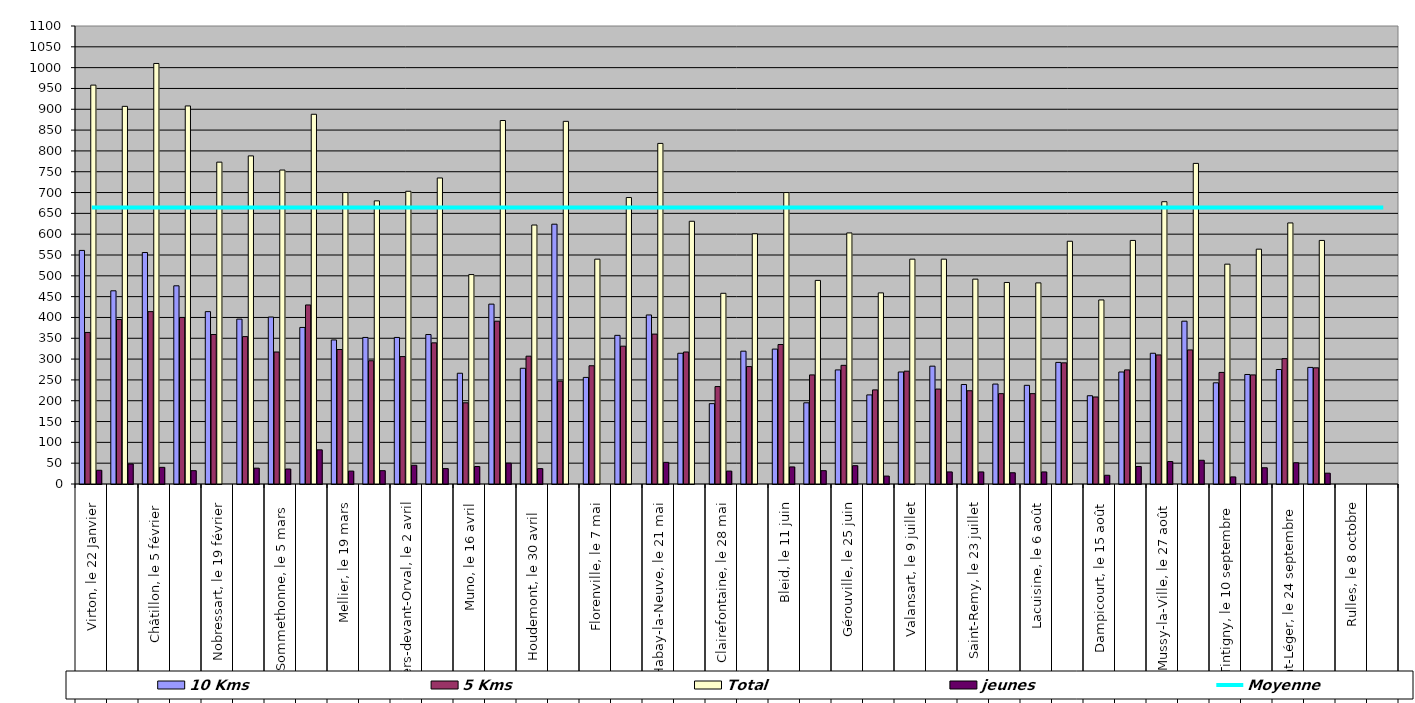
| Category | 10 Kms | 5 Kms | Total | jeunes |
|---|---|---|---|---|
| 0 | 561 | 364 | 958 | 33 |
| 1 | 464 | 395 | 907 | 48 |
| 2 | 556 | 414 | 1010 | 40 |
| 3 | 476 | 400 | 908 | 32 |
| 4 | 414 | 359 | 773 | 0 |
| 5 | 396 | 354 | 788 | 38 |
| 6 | 401 | 317 | 754 | 36 |
| 7 | 376 | 430 | 888 | 82 |
| 8 | 346 | 323 | 700 | 31 |
| 9 | 352 | 296 | 680 | 32 |
| 10 | 352 | 306 | 703 | 45 |
| 11 | 359 | 339 | 735 | 37 |
| 12 | 266 | 195 | 503 | 42 |
| 13 | 432 | 391 | 873 | 50 |
| 14 | 278 | 307 | 622 | 37 |
| 15 | 624 | 247 | 871 | 0 |
| 16 | 256 | 284 | 540 | 0 |
| 17 | 357 | 331 | 688 | 0 |
| 18 | 406 | 360 | 818 | 52 |
| 19 | 314 | 317 | 631 | 0 |
| 20 | 193 | 234 | 458 | 31 |
| 21 | 319 | 282 | 601 | 0 |
| 22 | 324 | 335 | 700 | 41 |
| 23 | 195 | 262 | 489 | 32 |
| 24 | 274 | 285 | 603 | 44 |
| 25 | 214 | 226 | 459 | 19 |
| 26 | 269 | 271 | 540 | 0 |
| 27 | 283 | 228 | 540 | 29 |
| 28 | 239 | 224 | 492 | 29 |
| 29 | 240 | 217 | 484 | 27 |
| 30 | 237 | 217 | 483 | 29 |
| 31 | 292 | 291 | 583 | 0 |
| 32 | 212 | 209 | 442 | 21 |
| 33 | 269 | 274 | 585 | 42 |
| 34 | 314 | 310 | 678 | 54 |
| 35 | 391 | 322 | 770 | 57 |
| 36 | 243 | 268 | 528 | 17 |
| 37 | 263 | 262 | 564 | 39 |
| 38 | 275 | 301 | 627 | 51 |
| 39 | 280 | 279 | 585 | 26 |
| 40 | 0 | 0 | 0 | 0 |
| 41 | 0 | 0 | 0 | 0 |